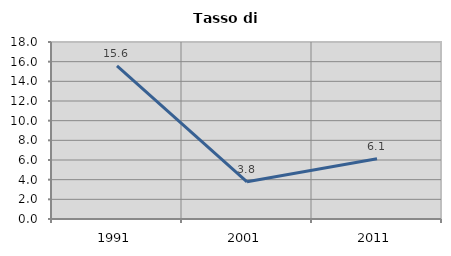
| Category | Tasso di disoccupazione   |
|---|---|
| 1991.0 | 15.577 |
| 2001.0 | 3.779 |
| 2011.0 | 6.122 |